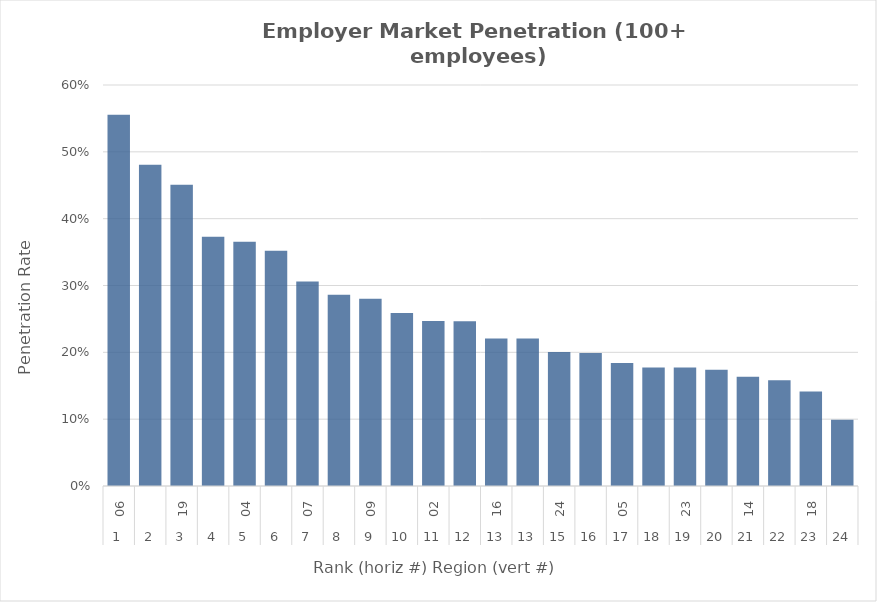
| Category | Rate |
|---|---|
| 0 | 0.556 |
| 1 | 0.481 |
| 2 | 0.451 |
| 3 | 0.373 |
| 4 | 0.365 |
| 5 | 0.352 |
| 6 | 0.306 |
| 7 | 0.286 |
| 8 | 0.28 |
| 9 | 0.259 |
| 10 | 0.247 |
| 11 | 0.246 |
| 12 | 0.221 |
| 13 | 0.221 |
| 14 | 0.201 |
| 15 | 0.199 |
| 16 | 0.184 |
| 17 | 0.177 |
| 18 | 0.177 |
| 19 | 0.174 |
| 20 | 0.163 |
| 21 | 0.158 |
| 22 | 0.142 |
| 23 | 0.099 |